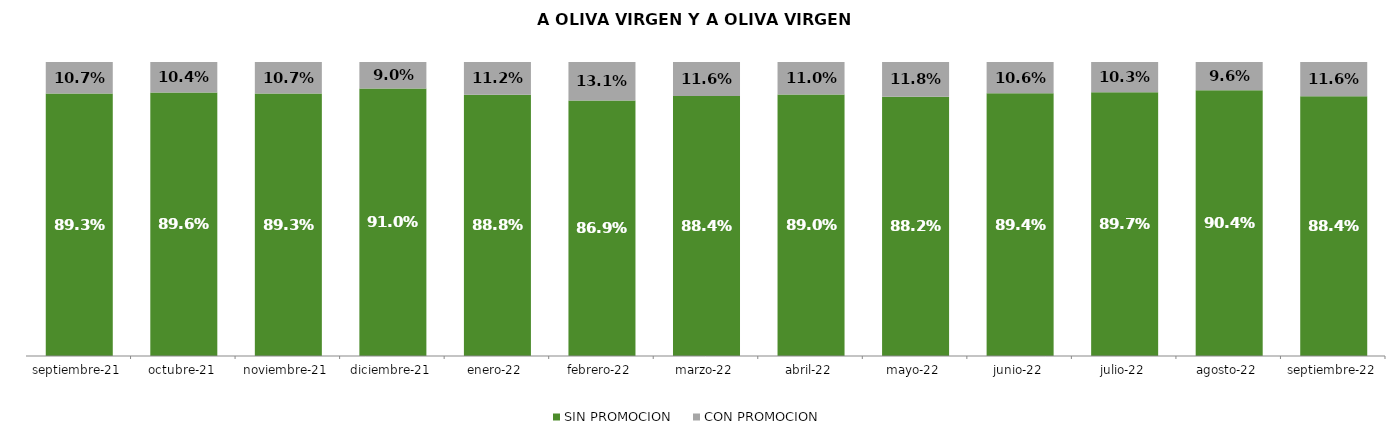
| Category | SIN PROMOCION   | CON PROMOCION   |
|---|---|---|
| 2021-09-01 | 0.893 | 0.107 |
| 2021-10-01 | 0.896 | 0.104 |
| 2021-11-01 | 0.893 | 0.107 |
| 2021-12-01 | 0.91 | 0.09 |
| 2022-01-01 | 0.888 | 0.112 |
| 2022-02-01 | 0.869 | 0.131 |
| 2022-03-01 | 0.884 | 0.116 |
| 2022-04-01 | 0.89 | 0.11 |
| 2022-05-01 | 0.882 | 0.118 |
| 2022-06-01 | 0.894 | 0.106 |
| 2022-07-01 | 0.897 | 0.103 |
| 2022-08-01 | 0.904 | 0.096 |
| 2022-09-01 | 0.884 | 0.116 |